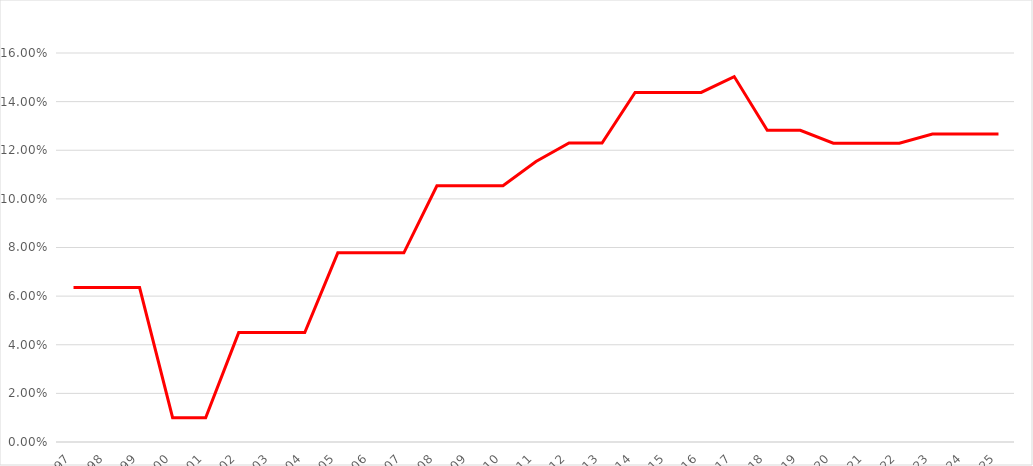
| Category | Series 0 |
|---|---|
| 1997.0 | 0.064 |
| 1998.0 | 0.064 |
| 1999.0 | 0.064 |
| 2000.0 | 0.01 |
| 2001.0 | 0.01 |
| 2002.0 | 0.045 |
| 2003.0 | 0.045 |
| 2004.0 | 0.045 |
| 2005.0 | 0.078 |
| 2006.0 | 0.078 |
| 2007.0 | 0.078 |
| 2008.0 | 0.105 |
| 2009.0 | 0.105 |
| 2010.0 | 0.105 |
| 2011.0 | 0.115 |
| 2012.0 | 0.123 |
| 2013.0 | 0.123 |
| 2014.0 | 0.144 |
| 2015.0 | 0.144 |
| 2016.0 | 0.144 |
| 2017.0 | 0.15 |
| 2018.0 | 0.128 |
| 2019.0 | 0.128 |
| 2020.0 | 0.123 |
| 2021.0 | 0.123 |
| 2022.0 | 0.123 |
| 2023.0 | 0.127 |
| 2024.0 | 0.127 |
| 2025.0 | 0.127 |